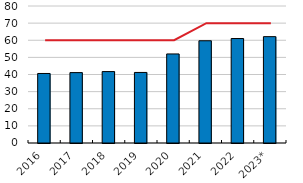
| Category | Overall public debt |
|---|---|
| 2016 | 40.6 |
| 2017 | 41.1 |
| 2018 | 41.7 |
| 2019 | 41.2 |
| 2020 | 52 |
| 2021 | 59.7 |
| 2022 | 61 |
| 2023* | 62.1 |